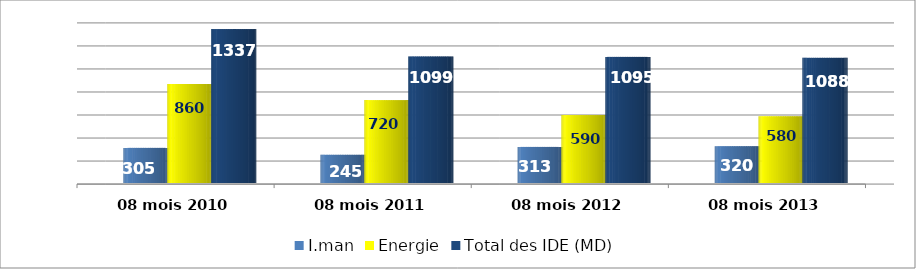
| Category | I.man | Energie | Total des IDE (MD) |
|---|---|---|---|
| 08 mois 2010 | 305.1 | 860 | 1337.3 |
| 08 mois 2011 | 245.2 | 720 | 1099.4 |
| 08 mois 2012 | 313.4 | 590 | 1095.4 |
| 08 mois 2013 | 320 | 580 | 1087.5 |